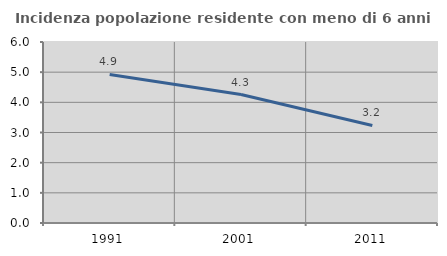
| Category | Incidenza popolazione residente con meno di 6 anni |
|---|---|
| 1991.0 | 4.925 |
| 2001.0 | 4.259 |
| 2011.0 | 3.232 |